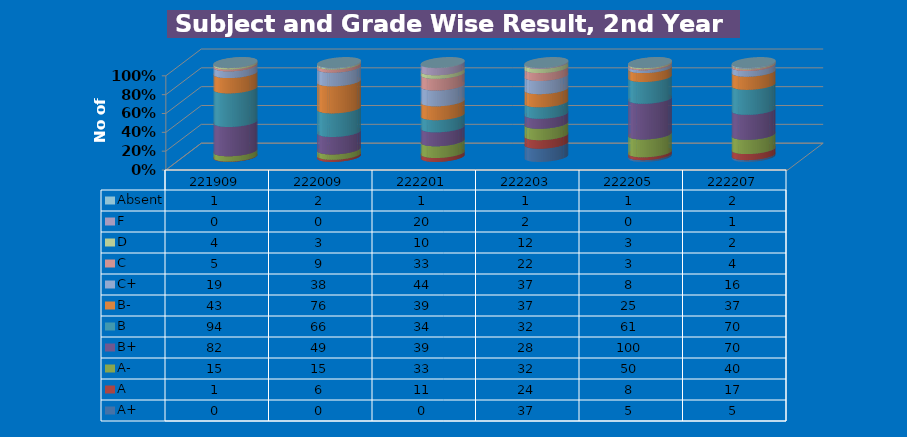
| Category | A+ | A | A- | B+ | B | B- | C+ | C | D | F | Absent |
|---|---|---|---|---|---|---|---|---|---|---|---|
| 221909.0 | 0 | 1 | 15 | 82 | 94 | 43 | 19 | 5 | 4 | 0 | 1 |
| 222009.0 | 0 | 6 | 15 | 49 | 66 | 76 | 38 | 9 | 3 | 0 | 2 |
| 222201.0 | 0 | 11 | 33 | 39 | 34 | 39 | 44 | 33 | 10 | 20 | 1 |
| 222203.0 | 37 | 24 | 32 | 28 | 32 | 37 | 37 | 22 | 12 | 2 | 1 |
| 222205.0 | 5 | 8 | 50 | 100 | 61 | 25 | 8 | 3 | 3 | 0 | 1 |
| 222207.0 | 5 | 17 | 40 | 70 | 70 | 37 | 16 | 4 | 2 | 1 | 2 |